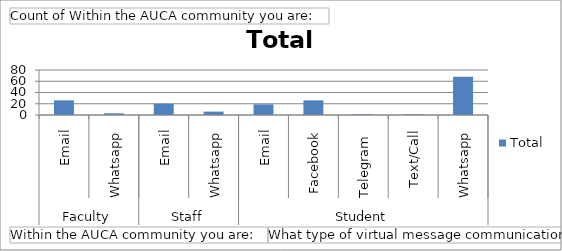
| Category | Total |
|---|---|
| 0 | 26 |
| 1 | 3 |
| 2 | 20 |
| 3 | 6 |
| 4 | 19 |
| 5 | 26 |
| 6 | 1 |
| 7 | 1 |
| 8 | 68 |